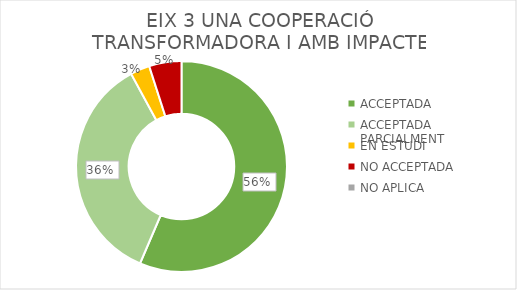
| Category | EIX 3 UNA COOPERACIÓ TRANSFORMADORA I AMB IMPACTE |
|---|---|
| ACCEPTADA | 57 |
| ACCEPTADA PARCIALMENT | 36 |
| EN ESTUDI | 3 |
| NO ACCEPTADA | 5 |
| NO APLICA | 0 |